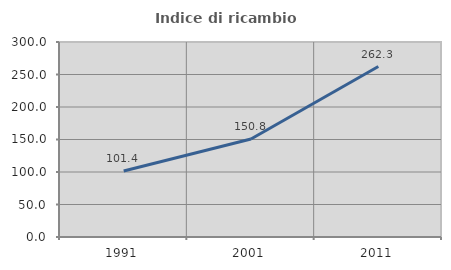
| Category | Indice di ricambio occupazionale  |
|---|---|
| 1991.0 | 101.418 |
| 2001.0 | 150.804 |
| 2011.0 | 262.267 |